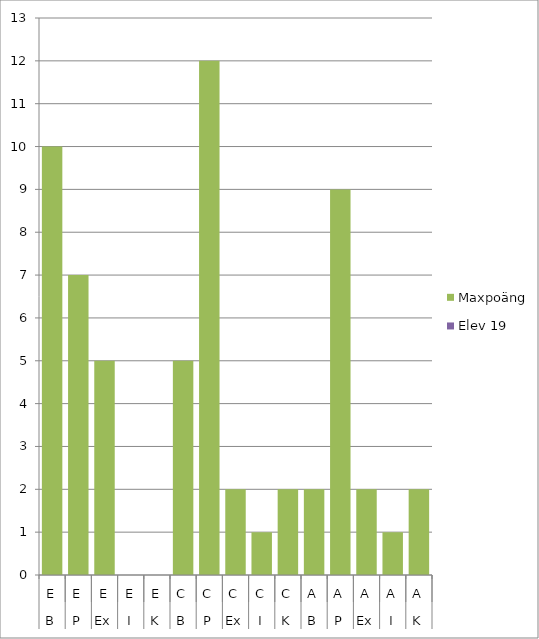
| Category | Maxpoäng | Elev 19 |
|---|---|---|
| 0 | 10 | 0 |
| 1 | 7 | 0 |
| 2 | 5 | 0 |
| 3 | 0 | 0 |
| 4 | 0 | 0 |
| 5 | 5 | 0 |
| 6 | 12 | 0 |
| 7 | 2 | 0 |
| 8 | 1 | 0 |
| 9 | 2 | 0 |
| 10 | 2 | 0 |
| 11 | 9 | 0 |
| 12 | 2 | 0 |
| 13 | 1 | 0 |
| 14 | 2 | 0 |